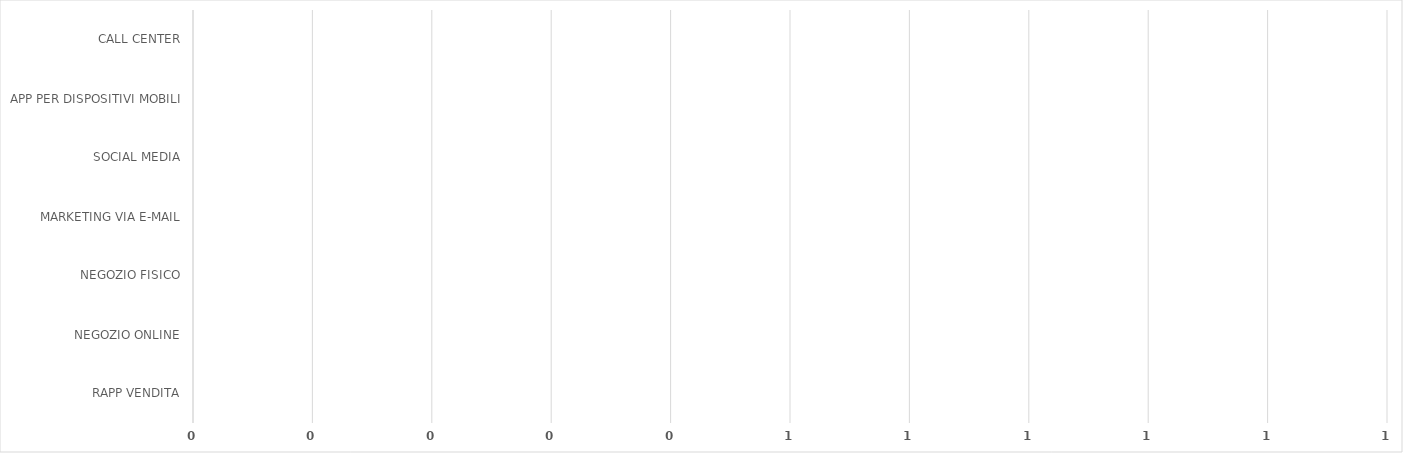
| Category | Series 0 |
|---|---|
| RAPP VENDITA | 0 |
| NEGOZIO ONLINE | 0 |
| NEGOZIO FISICO | 0 |
| MARKETING VIA E-MAIL | 0 |
| SOCIAL MEDIA | 0 |
| APP PER DISPOSITIVI MOBILI | 0 |
| CALL CENTER | 0 |